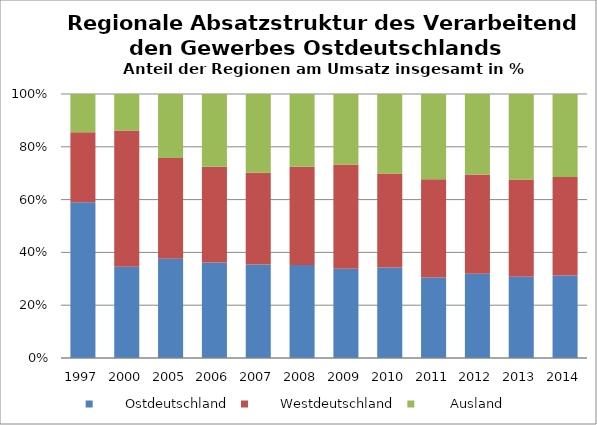
| Category |        Ostdeutschland |        Westdeutschland |         Ausland |
|---|---|---|---|
| 1997.0 | 59 | 26.5 | 14.5 |
| 2000.0 | 45.3 | 67.7 | 18.1 |
| 2005.0 | 37.6 | 38.2 | 24.2 |
| 2006.0 | 36.2 | 36.2 | 27.6 |
| 2007.0 | 35.4 | 34.8 | 29.8 |
| 2008.0 | 35.2 | 37.2 | 27.6 |
| 2009.0 | 33.8 | 39.5 | 26.7 |
| 2010.0 | 34.3 | 35.7 | 30.1 |
| 2011.0 | 30.5 | 37.2 | 32.3 |
| 2012.0 | 31.9 | 37.7 | 30.5 |
| 2013.0 | 30.8 | 36.8 | 32.4 |
| 2014.0 | 31.3 | 37.3 | 31.5 |